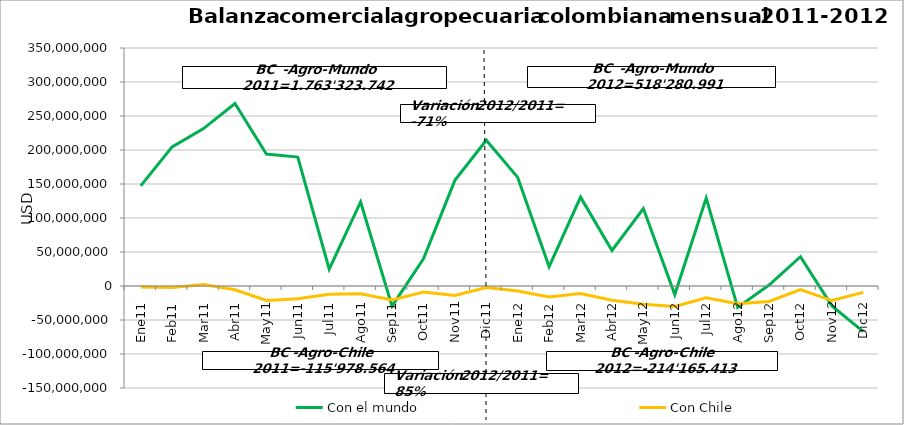
| Category | Con el mundo | Con Chile |
|---|---|---|
| 0 | 147170268.9 | -1332562.29 |
| 1 | 204650116.66 | -2127653.04 |
| 2 | 231423347.81 | 2352416.02 |
| 3 | 268381287.56 | -5460701.12 |
| 4 | 193958950.79 | -21322923.76 |
| 5 | 189518018.45 | -18601554.05 |
| 6 | 24694762.16 | -12279328.59 |
| 7 | 123602889.05 | -11448807.26 |
| 8 | -29681100.27 | -20486843.6 |
| 9 | 39906361.62 | -8970031.35 |
| 10 | 155339935.17 | -14072010.75 |
| 11 | 214358903.69 | -2228564.42 |
| 12 | 159718811.51 | -7213055.92 |
| 13 | 28364992.2 | -16041736.1 |
| 14 | 130703935.59 | -10935193.37 |
| 15 | 52247887.52 | -20915629.49 |
| 16 | 113869665.14 | -26906875.78 |
| 17 | -12554667.46 | -29964468.11 |
| 18 | 129307489.88 | -17249114.31 |
| 19 | -31469442.96 | -25920946.39 |
| 20 | 1432914.69 | -22834980.4 |
| 21 | 43090007.69 | -5375889.21 |
| 22 | -29233824.97 | -21394780.05 |
| 23 | -67196777.37 | -9412743.71 |